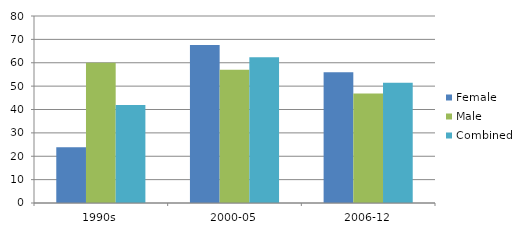
| Category | Female | Male | Combined |
|---|---|---|---|
| 1990s | 23.8 | 60 | 41.9 |
| 2000-05 | 67.6 | 57 | 62.3 |
| 2006-12 | 55.9 | 46.8 | 51.4 |